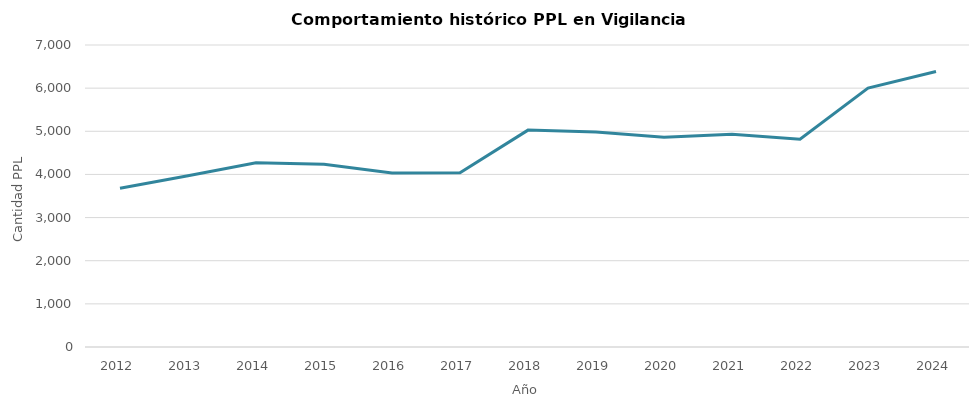
| Category | Promedio anual Vigilancia Electronica |
|---|---|
| 2012.0 | 3681.25 |
| 2013.0 | 3969.167 |
| 2014.0 | 4270.833 |
| 2015.0 | 4235.667 |
| 2016.0 | 4035.917 |
| 2017.0 | 4037.5 |
| 2018.0 | 5027.25 |
| 2019.0 | 4984.25 |
| 2020.0 | 4861 |
| 2021.0 | 4932.083 |
| 2022.0 | 4814.083 |
| 2023.0 | 6001.5 |
| 2024.0 | 6387 |